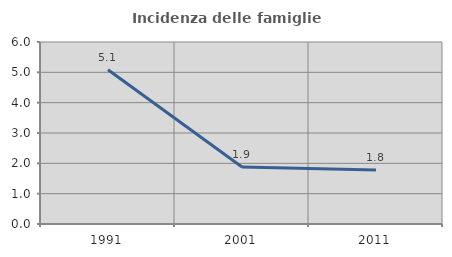
| Category | Incidenza delle famiglie numerose |
|---|---|
| 1991.0 | 5.087 |
| 2001.0 | 1.879 |
| 2011.0 | 1.784 |